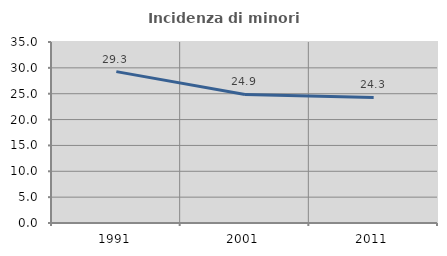
| Category | Incidenza di minori stranieri |
|---|---|
| 1991.0 | 29.268 |
| 2001.0 | 24.865 |
| 2011.0 | 24.277 |